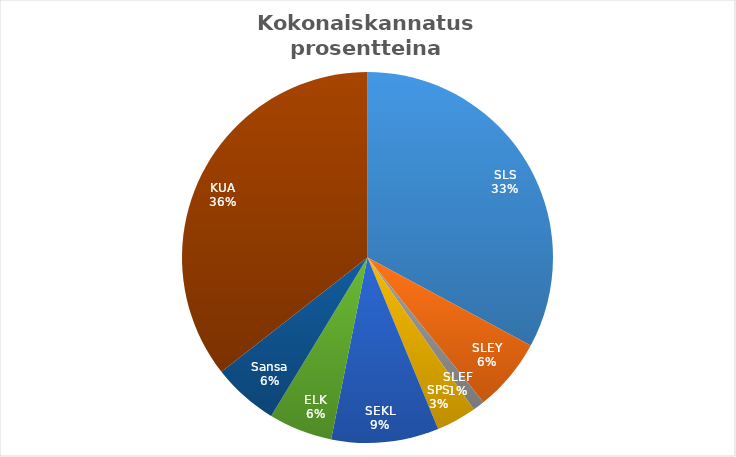
| Category | Series 0 |
|---|---|
| SLS | 19571361.27 |
| SLEY | 3803245.78 |
| SLEF | 608287.81 |
| SPS | 2081037.09 |
| SEKL | 5571991.056 |
| ELK | 3303382.03 |
| Sansa | 3417226.04 |
| KUA | 21174729.997 |